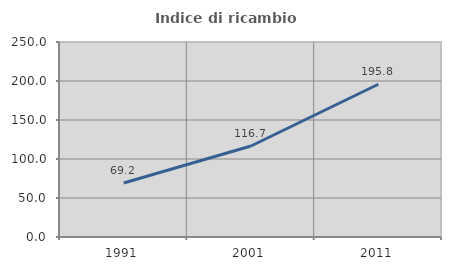
| Category | Indice di ricambio occupazionale  |
|---|---|
| 1991.0 | 69.231 |
| 2001.0 | 116.667 |
| 2011.0 | 195.833 |